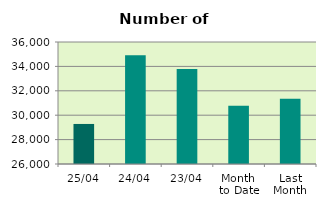
| Category | Series 0 |
|---|---|
| 25/04 | 29282 |
| 24/04 | 34918 |
| 23/04 | 33794 |
| Month 
to Date | 30777.765 |
| Last
Month | 31344.095 |